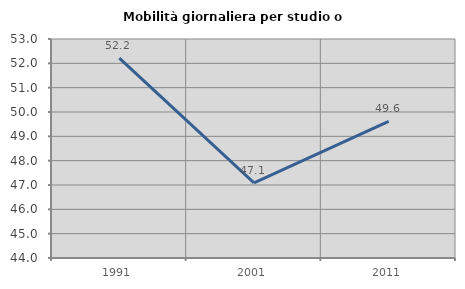
| Category | Mobilità giornaliera per studio o lavoro |
|---|---|
| 1991.0 | 52.211 |
| 2001.0 | 47.084 |
| 2011.0 | 49.614 |